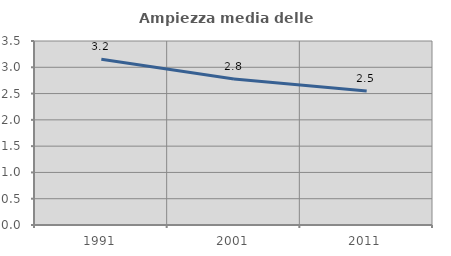
| Category | Ampiezza media delle famiglie |
|---|---|
| 1991.0 | 3.154 |
| 2001.0 | 2.777 |
| 2011.0 | 2.548 |